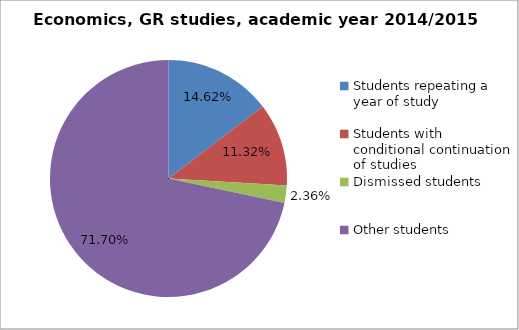
| Category | Series 0 |
|---|---|
| Students repeating a year of study | 31 |
| Students with conditional continuation of studies | 24 |
| Dismissed students | 5 |
| Other students | 152 |